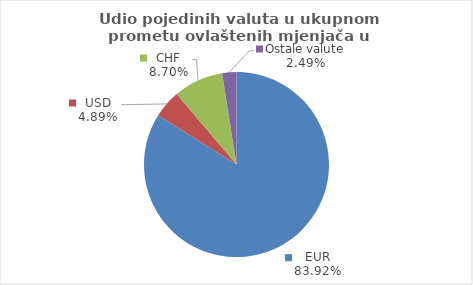
| Category | Series 0 |
|---|---|
| EUR | 83.923 |
| USD | 4.885 |
| CHF | 8.703 |
| Ostale valute | 2.489 |